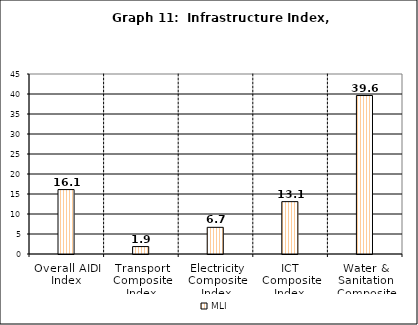
| Category | Series 0 | MLI | Series 2 |
|---|---|---|---|
| Overall AIDI Index |  | 16.108 |  |
| Transport Composite Index |  | 1.859 |  |
| Electricity Composite Index |  | 6.667 |  |
| ICT Composite Index  |  | 13.092 |  |
| Water & Sanitation Composite Index |  | 39.617 |  |